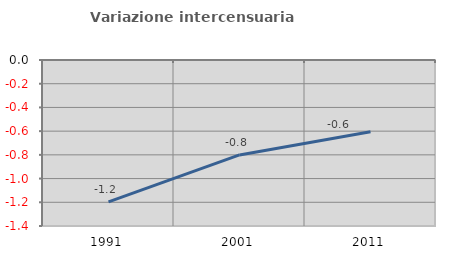
| Category | Variazione intercensuaria annua |
|---|---|
| 1991.0 | -1.196 |
| 2001.0 | -0.801 |
| 2011.0 | -0.605 |